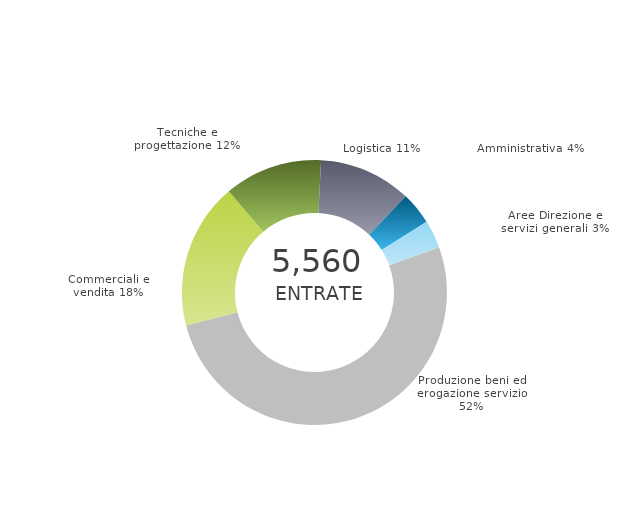
| Category | Series 0 | Series 1 |
|---|---|---|
| Produzione beni ed erogazione servizio | 0 | 0.516 |
| Commerciali e vendita | 0 | 0.178 |
| Tecniche e progettazione | 0 | 0.12 |
| Logistica | 0 | 0.113 |
| Amministrativa | 0 | 0.04 |
| Aree Direzione e servizi generali | 0 | 0.034 |